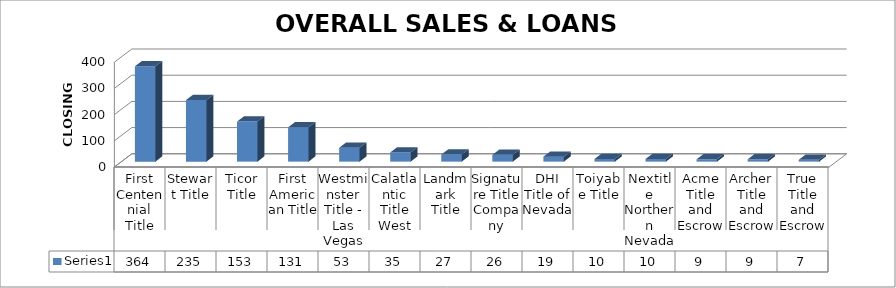
| Category | Series 0 |
|---|---|
| First Centennial Title | 364 |
| Stewart Title | 235 |
| Ticor Title | 153 |
| First American Title | 131 |
| Westminster Title - Las Vegas | 53 |
| Calatlantic Title West | 35 |
| Landmark Title | 27 |
| Signature Title Company | 26 |
| DHI Title of Nevada | 19 |
| Toiyabe Title | 10 |
| Nextitle Northern Nevada | 10 |
| Acme Title and Escrow | 9 |
| Archer Title and Escrow | 9 |
| True Title and Escrow | 7 |